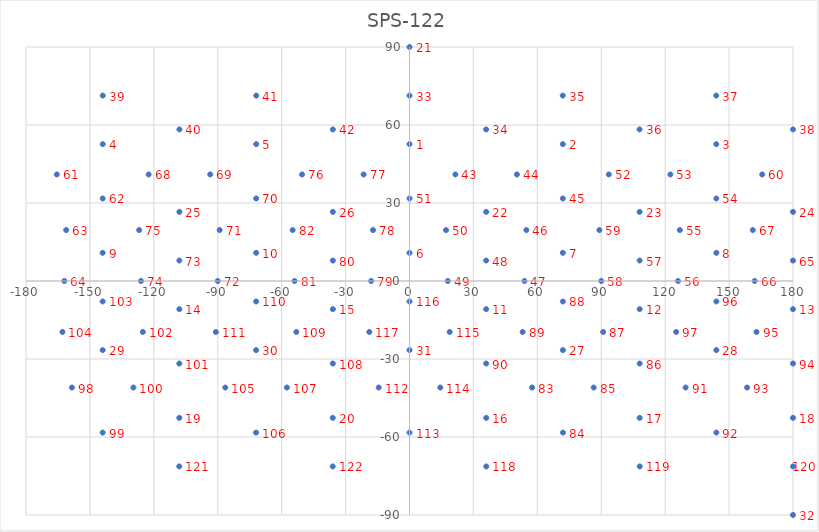
| Category | Series 0 |
|---|---|
| 0.0 | 52.637 |
| 71.95318757095295 | 52.644 |
| 143.97956567015038 | 52.634 |
| -143.97956567015038 | 52.634 |
| -71.95318757095295 | 52.644 |
| 0.0 | 10.838 |
| 71.97087412302828 | 10.835 |
| 144.02837430583426 | 10.834 |
| -144.02837430583426 | 10.834 |
| -71.97087412302828 | 10.835 |
| 35.97162569416552 | -10.834 |
| 108.02912587697212 | -10.835 |
| 179.99999999999983 | -10.838 |
| -108.02912587697212 | -10.835 |
| -35.97162569416552 | -10.834 |
| 36.0204343298495 | -52.634 |
| 108.04681242904745 | -52.644 |
| 179.99999999999983 | -52.637 |
| -108.04681242904745 | -52.644 |
| -36.0204343298495 | -52.634 |
| 0.0 | 89.986 |
| 35.97996273848708 | 26.578 |
| 108.00147767550763 | 26.585 |
| 179.99999999999983 | 26.578 |
| -108.00147767550763 | 26.585 |
| -35.97996273848708 | 26.578 |
| 71.99852232449277 | -26.585 |
| 144.02003726151304 | -26.578 |
| -144.02003726151304 | -26.578 |
| -71.99852232449277 | -26.585 |
| 0.0 | -26.578 |
| 179.99999999999983 | -89.986 |
| 0.0 | 71.309 |
| 35.97162569416552 | 58.292 |
| 71.93060696324414 | 71.318 |
| 107.973640115561 | 58.302 |
| 143.96559792073683 | 71.32 |
| 179.99999999999983 | 58.3 |
| -143.96559792073683 | 71.32 |
| -107.973640115561 | 58.302 |
| -71.93060696324414 | 71.318 |
| -35.97162569416552 | 58.292 |
| 21.54616637328822 | 40.971 |
| 50.40896787186871 | 40.973 |
| 71.96411980492154 | 31.741 |
| 54.847136160226356 | 19.595 |
| 53.9703720294683 | 0 |
| 35.97559876163715 | 7.87 |
| 17.98884987227379 | 0 |
| 17.12070222132344 | 19.596 |
| 0.0 | 31.742 |
| 93.54229743005615 | 40.983 |
| 122.43607276906816 | 40.973 |
| 144.00973184207055 | 31.736 |
| 126.88903201411622 | 19.599 |
| 126.02962797053186 | 0 |
| 108.0159497442208 | 7.874 |
| 90.0000000000002 | 0 |
| 89.11285029850993 | 19.6 |
| 165.54923615164776 | 40.973 |
| -165.54923615164776 | 40.973 |
| -144.00973184207055 | 31.736 |
| -161.14207859483685 | 19.593 |
| -162.01115012772598 | 0 |
| 179.99999999999983 | 7.872 |
| 162.01115012772598 | 0 |
| 161.14207859483685 | 19.593 |
| -122.43607276906816 | 40.973 |
| -93.54229743005615 | 40.983 |
| -71.96411980492154 | 31.741 |
| -89.11285029850993 | 19.6 |
| -90.0000000000002 | 0 |
| -108.0159497442208 | 7.874 |
| -126.02962797053186 | 0 |
| -126.88903201411622 | 19.599 |
| -50.40896787186871 | 40.973 |
| -21.54616637328822 | 40.971 |
| -17.120702221323498 | 19.596 |
| -17.98884987227379 | 0 |
| -35.97559876163715 | 7.87 |
| -53.9703720294683 | 0 |
| -54.847136160226356 | 19.595 |
| 57.56392723093168 | -40.973 |
| 72.02635988443882 | -58.302 |
| 86.45770256994368 | -40.983 |
| 108.03588019507829 | -31.741 |
| 90.88714970149046 | -19.6 |
| 71.98405025577901 | -7.874 |
| 53.11096798588371 | -19.599 |
| 35.990268157929705 | -31.736 |
| 129.59103212813156 | -40.973 |
| 144.02837430583426 | -58.292 |
| 158.45383362671188 | -40.971 |
| 179.99999999999983 | -31.742 |
| 162.87929777867643 | -19.596 |
| 144.02440123836286 | -7.87 |
| 125.15286383977349 | -19.595 |
| -158.45383362671188 | -40.971 |
| -144.02837430583426 | -58.292 |
| -129.59103212813156 | -40.973 |
| -108.03588019507829 | -31.741 |
| -125.15286383977349 | -19.595 |
| -144.02440123836286 | -7.87 |
| -162.87929777867643 | -19.596 |
| -86.45770256994368 | -40.983 |
| -72.02635988443882 | -58.302 |
| -57.56392723093168 | -40.973 |
| -35.990268157929705 | -31.736 |
| -53.11096798588371 | -19.599 |
| -71.98405025577901 | -7.874 |
| -90.88714970149046 | -19.6 |
| -14.450763848352345 | -40.973 |
| 0.0 | -58.3 |
| 14.450763848352345 | -40.973 |
| 18.857921405163232 | -19.593 |
| 0.0 | -7.872 |
| -18.857921405163232 | -19.593 |
| 36.034402079263224 | -71.32 |
| 108.06939303675625 | -71.318 |
| 179.99999999999983 | -71.309 |
| -108.06939303675625 | -71.318 |
| -36.034402079263224 | -71.32 |